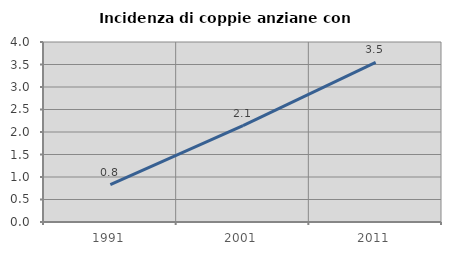
| Category | Incidenza di coppie anziane con figli |
|---|---|
| 1991.0 | 0.831 |
| 2001.0 | 2.142 |
| 2011.0 | 3.545 |